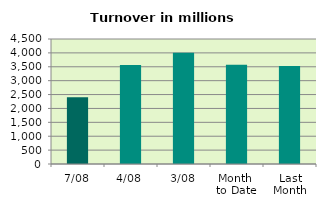
| Category | Series 0 |
|---|---|
| 7/08 | 2404.475 |
| 4/08 | 3567.074 |
| 3/08 | 4007.614 |
| Month 
to Date | 3571.281 |
| Last
Month | 3531.02 |